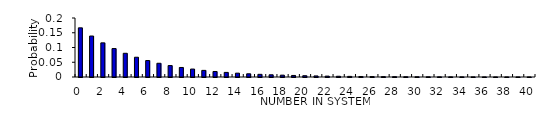
| Category | Series 0 |
|---|---|
| 0.0 | 0.167 |
| 1.0 | 0.139 |
| 2.0 | 0.116 |
| 3.0 | 0.096 |
| 4.0 | 0.08 |
| 5.0 | 0.067 |
| 6.0 | 0.056 |
| 7.0 | 0.047 |
| 8.0 | 0.039 |
| 9.0 | 0.032 |
| 10.0 | 0.027 |
| 11.0 | 0.022 |
| 12.0 | 0.019 |
| 13.0 | 0.016 |
| 14.0 | 0.013 |
| 15.0 | 0.011 |
| 16.0 | 0.009 |
| 17.0 | 0.008 |
| 18.0 | 0.006 |
| 19.0 | 0.005 |
| 20.0 | 0.004 |
| 21.0 | 0.004 |
| 22.0 | 0.003 |
| 23.0 | 0.003 |
| 24.0 | 0.002 |
| 25.0 | 0.002 |
| 26.0 | 0.001 |
| 27.0 | 0.001 |
| 28.0 | 0.001 |
| 29.0 | 0.001 |
| 30.0 | 0.001 |
| 31.0 | 0.001 |
| 32.0 | 0 |
| 33.0 | 0 |
| 34.0 | 0 |
| 35.0 | 0 |
| 36.0 | 0 |
| 37.0 | 0 |
| 38.0 | 0 |
| 39.0 | 0 |
| 40.0 | 0 |